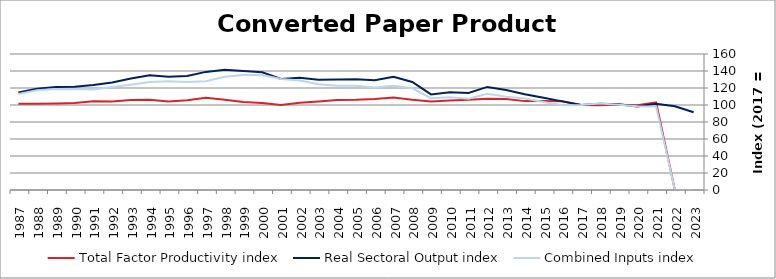
| Category | Total Factor Productivity index | Real Sectoral Output index | Combined Inputs index |
|---|---|---|---|
| 2023.0 | 0 | 91.453 | 0 |
| 2022.0 | 0 | 98.524 | 0 |
| 2021.0 | 103.176 | 101.383 | 98.262 |
| 2020.0 | 99.677 | 98.165 | 98.483 |
| 2019.0 | 100.355 | 100.742 | 100.386 |
| 2018.0 | 99.704 | 101.534 | 101.835 |
| 2017.0 | 100 | 100 | 100 |
| 2016.0 | 104.502 | 104.274 | 99.782 |
| 2015.0 | 104.741 | 108.424 | 103.516 |
| 2014.0 | 104.565 | 112.665 | 107.746 |
| 2013.0 | 107.114 | 117.597 | 109.787 |
| 2012.0 | 107.243 | 121.268 | 113.078 |
| 2011.0 | 106.303 | 114.075 | 107.311 |
| 2010.0 | 105.329 | 114.958 | 109.141 |
| 2009.0 | 104.105 | 112.468 | 108.033 |
| 2008.0 | 106.155 | 127.035 | 119.669 |
| 2007.0 | 108.757 | 133.301 | 122.568 |
| 2006.0 | 107.053 | 129.054 | 120.551 |
| 2005.0 | 106.247 | 130.397 | 122.731 |
| 2004.0 | 105.95 | 129.905 | 122.609 |
| 2003.0 | 104.213 | 129.683 | 124.441 |
| 2002.0 | 102.525 | 131.94 | 128.69 |
| 2001.0 | 99.987 | 130.667 | 130.685 |
| 2000.0 | 102.403 | 138.402 | 135.154 |
| 1999.0 | 103.532 | 140.115 | 135.335 |
| 1998.0 | 106.038 | 141.375 | 133.324 |
| 1997.0 | 108.64 | 138.95 | 127.9 |
| 1996.0 | 105.501 | 134.135 | 127.141 |
| 1995.0 | 104.065 | 133.205 | 128.002 |
| 1994.0 | 106.173 | 134.898 | 127.055 |
| 1993.0 | 105.756 | 131.08 | 123.946 |
| 1992.0 | 104.198 | 126.354 | 121.262 |
| 1991.0 | 104.323 | 123.394 | 118.28 |
| 1990.0 | 102.439 | 121.365 | 118.475 |
| 1989.0 | 101.845 | 121.069 | 118.875 |
| 1988.0 | 101.546 | 119.088 | 117.274 |
| 1987.0 | 101.557 | 114.812 | 113.051 |